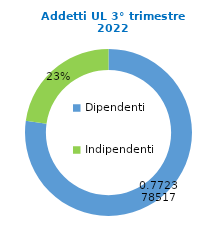
| Category | Series 0 |
|---|---|
| Dipendenti | 73688 |
| Indipendenti | 21716 |